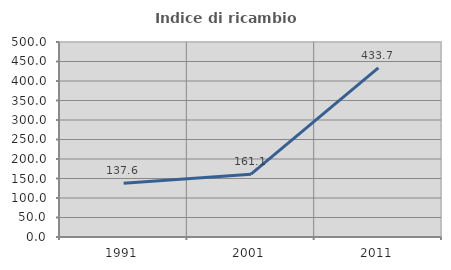
| Category | Indice di ricambio occupazionale  |
|---|---|
| 1991.0 | 137.6 |
| 2001.0 | 161.074 |
| 2011.0 | 433.673 |